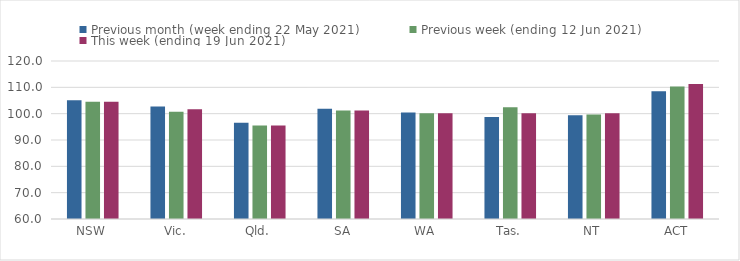
| Category | Previous month (week ending 22 May 2021) | Previous week (ending 12 Jun 2021) | This week (ending 19 Jun 2021) |
|---|---|---|---|
| NSW | 105.06 | 104.54 | 104.54 |
| Vic. | 102.69 | 100.72 | 101.72 |
| Qld. | 96.57 | 95.46 | 95.46 |
| SA | 101.86 | 101.17 | 101.17 |
| WA | 100.44 | 100.2 | 100.2 |
| Tas. | 98.75 | 102.46 | 100.14 |
| NT | 99.41 | 99.7 | 100.14 |
| ACT | 108.48 | 110.3 | 111.27 |